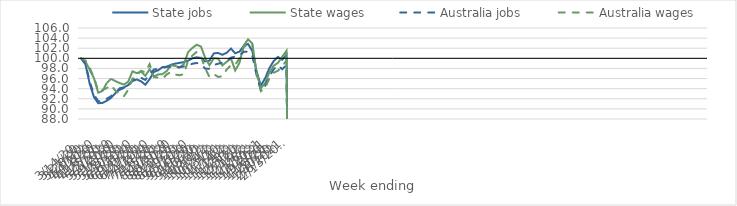
| Category | State jobs | State wages | Australia jobs | Australia wages |
|---|---|---|---|---|
| 14/03/2020 | 100 | 100 | 100 | 100 |
| 21/03/2020 | 98.83 | 99.389 | 98.956 | 99.592 |
| 28/03/2020 | 94.968 | 97.721 | 95.411 | 98.113 |
| 04/04/2020 | 92.328 | 96.069 | 92.812 | 96.235 |
| 11/04/2020 | 91.112 | 93.195 | 91.52 | 93.527 |
| 18/04/2020 | 91.188 | 93.546 | 91.496 | 93.723 |
| 25/04/2020 | 91.603 | 95.149 | 92.021 | 94.131 |
| 02/05/2020 | 92.197 | 95.95 | 92.516 | 94.682 |
| 09/05/2020 | 93.093 | 95.491 | 93.196 | 93.605 |
| 16/05/2020 | 94.079 | 95.11 | 93.786 | 92.839 |
| 23/05/2020 | 94.267 | 94.818 | 94.144 | 92.494 |
| 30/05/2020 | 94.696 | 95.363 | 94.649 | 93.8 |
| 06/06/2020 | 95.51 | 97.433 | 95.633 | 95.98 |
| 13/06/2020 | 95.815 | 97.061 | 96.135 | 96.637 |
| 20/06/2020 | 95.457 | 97.377 | 96.155 | 97.543 |
| 27/06/2020 | 94.777 | 96.55 | 95.736 | 97.22 |
| 04/07/2020 | 95.869 | 97.846 | 96.811 | 98.854 |
| 11/07/2020 | 97.317 | 96.408 | 97.797 | 96.324 |
| 18/07/2020 | 97.626 | 96.806 | 97.892 | 96.165 |
| 25/07/2020 | 98.266 | 96.874 | 98.105 | 95.98 |
| 01/08/2020 | 98.331 | 97.481 | 98.318 | 96.817 |
| 08/08/2020 | 98.731 | 98.602 | 98.31 | 97.297 |
| 15/08/2020 | 98.948 | 98.497 | 98.2 | 96.802 |
| 22/08/2020 | 99.105 | 98.177 | 98.249 | 96.652 |
| 29/08/2020 | 99.248 | 98.856 | 98.38 | 96.868 |
| 05/09/2020 | 99.546 | 101.232 | 98.54 | 99.571 |
| 12/09/2020 | 100.007 | 102.051 | 98.935 | 100.548 |
| 19/09/2020 | 100.205 | 102.692 | 99.081 | 101.275 |
| 26/09/2020 | 100.08 | 102.334 | 98.859 | 100.413 |
| 03/10/2020 | 99.405 | 100.07 | 97.958 | 97.98 |
| 10/10/2020 | 99.546 | 98.638 | 97.945 | 96.303 |
| 17/10/2020 | 100.978 | 100.034 | 98.678 | 96.878 |
| 24/10/2020 | 101.067 | 99.965 | 98.932 | 96.325 |
| 31/10/2020 | 100.703 | 98.602 | 99.127 | 96.446 |
| 07/11/2020 | 101.092 | 99.31 | 99.458 | 97.753 |
| 14/11/2020 | 101.94 | 100.007 | 100.12 | 98.654 |
| 21/11/2020 | 101 | 97.604 | 100.358 | 98.686 |
| 28/11/2020 | 101.323 | 99.089 | 100.609 | 100.004 |
| 05/12/2020 | 102.456 | 102.535 | 101.271 | 102.199 |
| 12/12/2020 | 102.856 | 103.747 | 101.353 | 102.847 |
| 19/12/2020 | 101.452 | 102.95 | 100.515 | 102.738 |
| 26/12/2020 | 97.421 | 96.989 | 96.696 | 97.23 |
| 02/01/2021 | 94.593 | 94.137 | 93.609 | 93.51 |
| 09/01/2021 | 96.048 | 95.074 | 94.526 | 94.153 |
| 16/01/2021 | 98.064 | 97.216 | 96.434 | 96.036 |
| 23/01/2021 | 99.464 | 98.534 | 97.839 | 97.148 |
| 30/01/2021 | 100.272 | 99.111 | 98.639 | 97.559 |
| 06/02/2021 | 99.729 | 100.328 | 97.828 | 98.431 |
| 13/02/2021 | 100.727 | 101.511 | 98.686 | 99.61 |